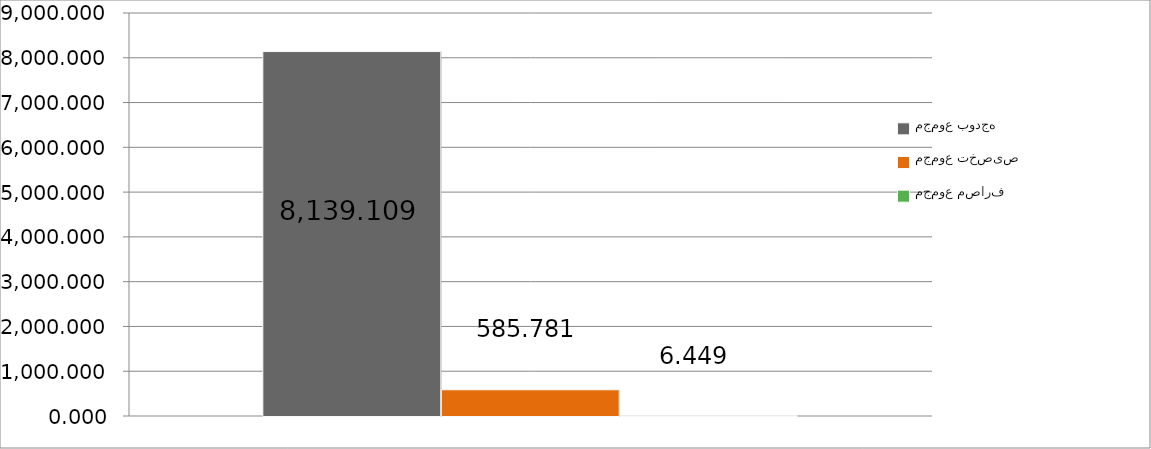
| Category | مجموع بودجه  | مجموع تخصیص | مجموع مصارف |
|---|---|---|---|
| 0 | 8139.109 | 585.781 | 6.449 |